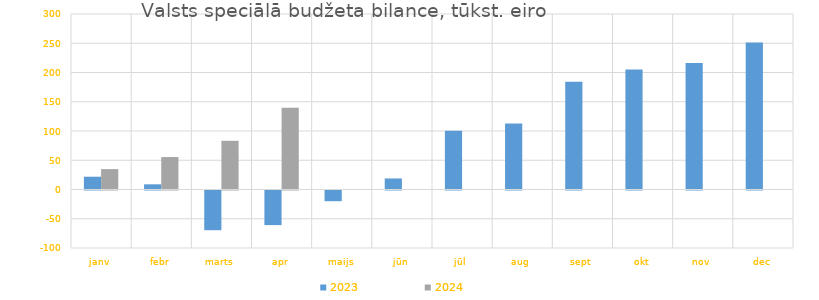
| Category | 2023 | 2024 |
|---|---|---|
| janv | 21850.373 | 34837.439 |
| febr | 8860.895 | 55473.418 |
| marts | -67878.961 | 83250.759 |
| apr | -59148.923 | 139544.306 |
| maijs | -18273.46 | 0 |
| jūn | 18868.968 | 0 |
| jūl | 100483.566 | 0 |
| aug | 112828.993 | 0 |
| sept | 184000.505 | 0 |
| okt | 205121.199 | 0 |
| nov | 216425.067 | 0 |
| dec | 251412.782 | 0 |